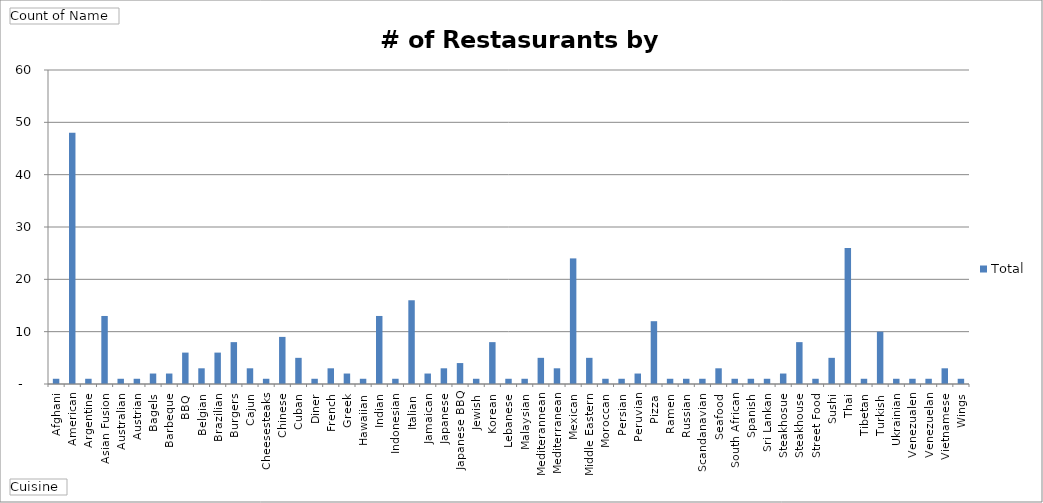
| Category | Total |
|---|---|
| Afghani | 1 |
| American | 48 |
| Argentine | 1 |
| Asian Fusion | 13 |
| Australian | 1 |
| Austrian | 1 |
| Bagels | 2 |
| Barbeque | 2 |
| BBQ | 6 |
| Belgian | 3 |
| Brazilian | 6 |
| Burgers | 8 |
| Cajun | 3 |
| Cheesesteaks | 1 |
| Chinese | 9 |
| Cuban | 5 |
| Diner | 1 |
| French | 3 |
| Greek | 2 |
| Hawaiian | 1 |
| Indian | 13 |
| Indonesian | 1 |
| Italian | 16 |
| Jamaican | 2 |
| Japanese | 3 |
| Japanese BBQ | 4 |
| Jewish | 1 |
| Korean | 8 |
| Lebanese | 1 |
| Malaysian | 1 |
| Mediterannean | 5 |
| Mediterranean | 3 |
| Mexican | 24 |
| Middle Eastern | 5 |
| Moroccan | 1 |
| Persian | 1 |
| Peruvian | 2 |
| Pizza | 12 |
| Ramen | 1 |
| Russian | 1 |
| Scandanavian | 1 |
| Seafood | 3 |
| South African | 1 |
| Spanish | 1 |
| Sri Lankan | 1 |
| Steakhosue | 2 |
| Steakhouse | 8 |
| Street Food | 1 |
| Sushi | 5 |
| Thai | 26 |
| Tibetan | 1 |
| Turkish | 10 |
| Ukrainian | 1 |
| Venezualen | 1 |
| Venezuelan | 1 |
| Vietnamese | 3 |
| Wings | 1 |